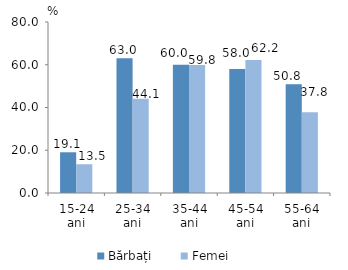
| Category | Bărbați | Femei |
|---|---|---|
| 15-24 ani | 19.055 | 13.464 |
| 25-34 ani | 63.044 | 44.054 |
| 35-44 ani | 60.009 | 59.839 |
| 45-54 ani | 57.978 | 62.223 |
| 55-64 ani | 50.84 | 37.776 |